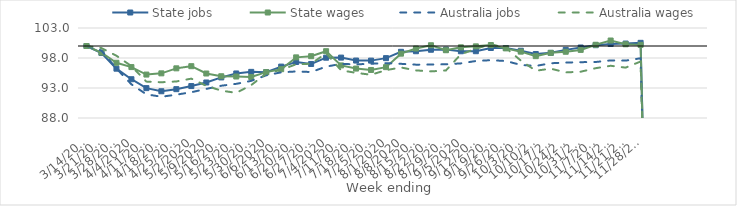
| Category | State jobs | State wages | Australia jobs | Australia wages |
|---|---|---|---|---|
| 14/03/2020 | 100 | 100 | 100 | 100 |
| 21/03/2020 | 98.828 | 98.904 | 99.244 | 99.654 |
| 28/03/2020 | 96.22 | 97.203 | 96.24 | 98.376 |
| 04/04/2020 | 94.463 | 96.486 | 93.611 | 96.647 |
| 11/04/2020 | 92.979 | 95.239 | 91.951 | 94.065 |
| 18/04/2020 | 92.456 | 95.441 | 91.54 | 93.96 |
| 25/04/2020 | 92.807 | 96.278 | 91.89 | 94.086 |
| 02/05/2020 | 93.323 | 96.638 | 92.294 | 94.563 |
| 09/05/2020 | 93.917 | 95.414 | 92.851 | 93.362 |
| 16/05/2020 | 94.764 | 94.958 | 93.38 | 92.559 |
| 23/05/2020 | 95.422 | 94.912 | 93.691 | 92.191 |
| 30/05/2020 | 95.689 | 94.828 | 94.189 | 93.489 |
| 06/06/2020 | 95.634 | 95.645 | 95.112 | 95.384 |
| 13/06/2020 | 96.567 | 96.133 | 95.61 | 96.041 |
| 20/06/2020 | 97.331 | 98.105 | 95.758 | 96.951 |
| 27/06/2020 | 97.005 | 98.302 | 95.662 | 97.048 |
| 04/07/2020 | 98.051 | 99.135 | 96.562 | 98.782 |
| 11/07/2020 | 98.066 | 96.765 | 97.02 | 95.951 |
| 18/07/2020 | 97.574 | 96.238 | 96.939 | 95.522 |
| 25/07/2020 | 97.564 | 96.007 | 97.042 | 95.21 |
| 01/08/2020 | 97.978 | 96.476 | 97.145 | 95.98 |
| 08/08/2020 | 99.031 | 98.721 | 97.028 | 96.418 |
| 15/08/2020 | 99.129 | 99.583 | 96.891 | 95.936 |
| 22/08/2020 | 99.377 | 100.126 | 96.912 | 95.768 |
| 29/08/2020 | 99.4 | 99.295 | 96.951 | 95.924 |
| 05/09/2020 | 99.125 | 99.779 | 97.102 | 98.618 |
| 12/09/2020 | 99.132 | 99.941 | 97.5 | 99.542 |
| 19/09/2020 | 99.668 | 100.163 | 97.636 | 100.304 |
| 26/09/2020 | 99.666 | 99.602 | 97.498 | 99.685 |
| 03/10/2020 | 99.207 | 99.057 | 96.847 | 97.575 |
| 10/10/2020 | 98.668 | 98.305 | 96.677 | 95.876 |
| 17/10/2020 | 98.859 | 98.856 | 97.124 | 96.224 |
| 24/10/2020 | 99.353 | 99.039 | 97.241 | 95.599 |
| 31/10/2020 | 99.75 | 99.35 | 97.306 | 95.715 |
| 07/11/2020 | 100.133 | 100.208 | 97.335 | 96.299 |
| 14/11/2020 | 100.332 | 100.915 | 97.6 | 96.705 |
| 21/11/2020 | 100.408 | 100.287 | 97.567 | 96.396 |
| 28/11/2020 | 100.528 | 100.192 | 97.955 | 97.416 |